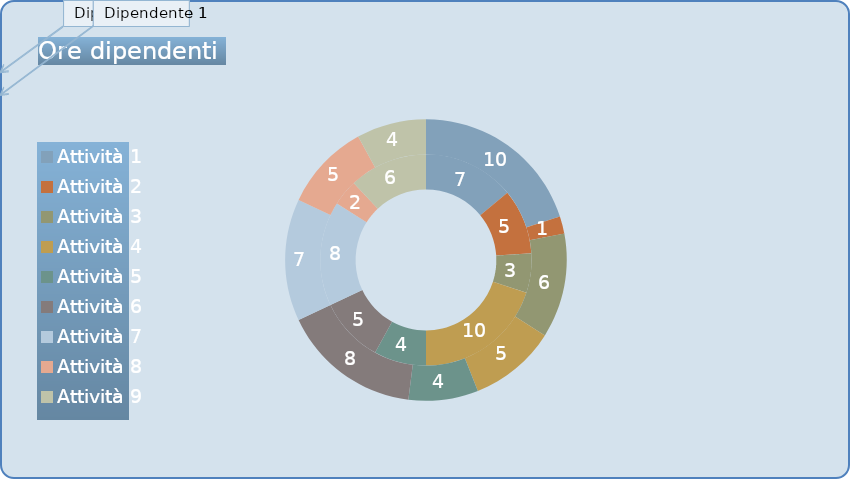
| Category | Dipendente 1 (ore) | Dipendente 2 (ore) |
|---|---|---|
| Attività 1 | 7 | 10 |
| Attività 2 | 5 | 1 |
| Attività 3 | 3 | 6 |
| Attività 4 | 10 | 5 |
| Attività 5 | 4 | 4 |
| Attività 6 | 5 | 8 |
| Attività 7 | 8 | 7 |
| Attività 8 | 2 | 5 |
| Attività 9 | 6 | 4 |